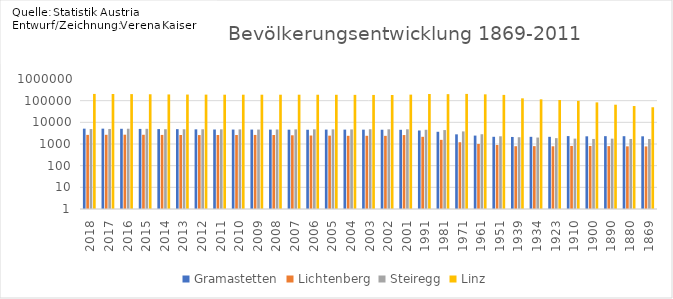
| Category | Gramastetten | Lichtenberg | Steiregg | Linz |
|---|---|---|---|---|
| 2018.0 | 5102 | 2637 | 4889 | 204846 |
| 2017.0 | 5108 | 2656 | 4943 | 203012 |
| 2016.0 | 5038 | 2687 | 5070 | 200839 |
| 2015.0 | 4965 | 2664 | 5019 | 197427 |
| 2014.0 | 4877 | 2626 | 4822 | 193814 |
| 2013.0 | 4841 | 2595 | 4797 | 191501 |
| 2012.0 | 4748 | 2585 | 4786 | 190053 |
| 2011.0 | 4670 | 2605 | 4758 | 188431 |
| 2010.0 | 4634 | 2598 | 4729 | 188549 |
| 2009.0 | 4627 | 2620 | 4647 | 188520 |
| 2008.0 | 4613 | 2601 | 4686 | 188277 |
| 2007.0 | 4586 | 2525 | 4739 | 188393 |
| 2006.0 | 4553 | 2465 | 4772 | 187936 |
| 2005.0 | 4617 | 2428 | 4751 | 186781 |
| 2004.0 | 4612 | 2391 | 4708 | 185172 |
| 2003.0 | 4592 | 2395 | 4796 | 183827 |
| 2002.0 | 4553 | 2378 | 4770 | 182304 |
| 2001.0 | 4525 | 2588 | 4779 | 189889 |
| 1991.0 | 4201 | 2147 | 4536 | 203044 |
| 1981.0 | 3663 | 1554 | 4394 | 199910 |
| 1971.0 | 2792 | 1206 | 3805 | 204889 |
| 1961.0 | 2443 | 1007 | 2825 | 195978 |
| 1951.0 | 2151 | 899 | 2270 | 184685 |
| 1939.0 | 2114 | 790 | 2056 | 128177 |
| 1934.0 | 2145 | 796 | 1986 | 115338 |
| 1923.0 | 2144 | 784 | 1864 | 107463 |
| 1910.0 | 2316 | 814 | 1773 | 97852 |
| 1900.0 | 2262 | 807 | 1709 | 83356 |
| 1890.0 | 2300 | 798 | 1765 | 65090 |
| 1880.0 | 2291 | 779 | 1708 | 56569 |
| 1869.0 | 2265 | 773 | 1705 | 49635 |